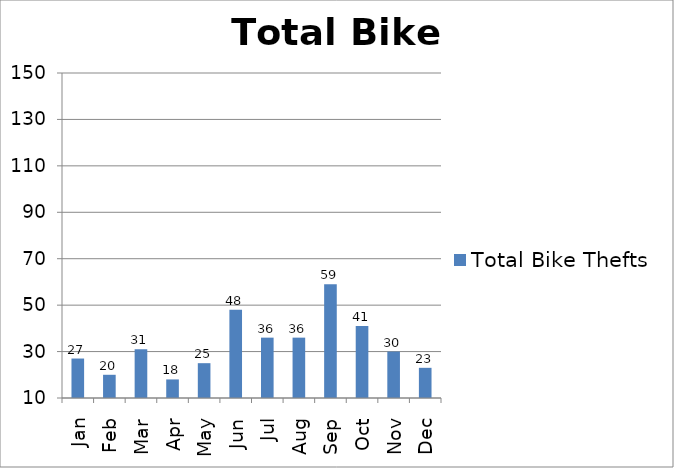
| Category | Total Bike Thefts |
|---|---|
| Jan | 27 |
| Feb | 20 |
| Mar | 31 |
| Apr | 18 |
| May | 25 |
| Jun | 48 |
| Jul | 36 |
| Aug | 36 |
| Sep | 59 |
| Oct | 41 |
| Nov | 30 |
| Dec | 23 |